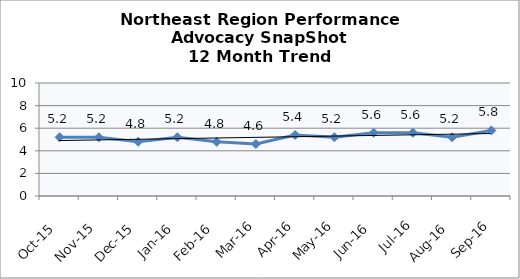
| Category | Northeast Region |
|---|---|
| Oct-15 | 5.2 |
| Nov-15 | 5.2 |
| Dec-15 | 4.8 |
| Jan-16 | 5.2 |
| Feb-16 | 4.8 |
| Mar-16 | 4.6 |
| Apr-16 | 5.4 |
| May-16 | 5.2 |
| Jun-16 | 5.6 |
| Jul-16 | 5.6 |
| Aug-16 | 5.2 |
| Sep-16 | 5.8 |